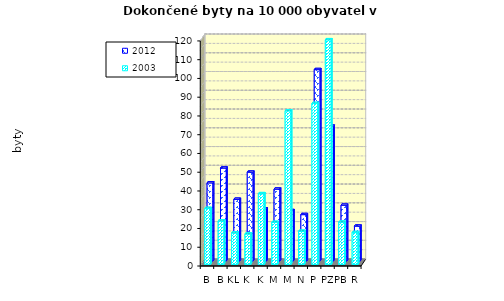
| Category | 2012 | 2003 |
|---|---|---|
| BN | 41.606 | 29.827 |
| BE | 49.514 | 23.174 |
| KL | 32.849 | 16.764 |
| KO | 47.321 | 16.205 |
| KH | 27.711 | 37.669 |
| ME | 38.263 | 22.401 |
| MB | 26.822 | 81.861 |
| NB | 24.692 | 17.646 |
| PH | 101.996 | 85.78 |
| PZ | 71.837 | 119.746 |
| PB | 29.704 | 22.49 |
| RA | 18.548 | 16.989 |